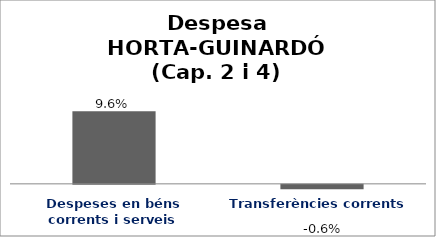
| Category | Series 0 |
|---|---|
| Despeses en béns corrents i serveis | 0.096 |
| Transferències corrents | -0.006 |